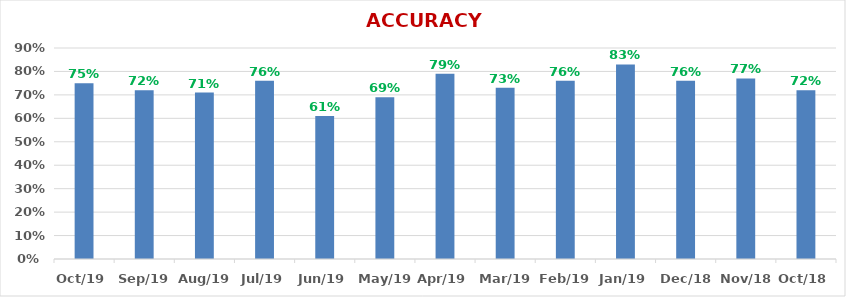
| Category | ACCURACY |
|---|---|
| 2019-10-01 | 0.75 |
| 2019-09-01 | 0.72 |
| 2019-08-01 | 0.71 |
| 2019-07-01 | 0.76 |
| 2019-06-01 | 0.61 |
| 2019-05-01 | 0.69 |
| 2019-04-01 | 0.79 |
| 2019-03-01 | 0.73 |
| 2019-02-01 | 0.76 |
| 2019-01-01 | 0.83 |
| 2018-12-01 | 0.76 |
| 2018-11-01 | 0.77 |
| 2018-10-01 | 0.72 |